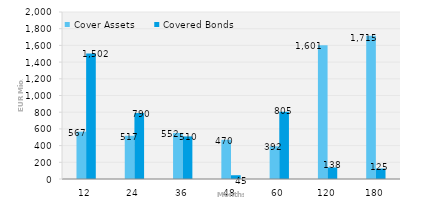
| Category | Cover Assets | Covered Bonds |
|---|---|---|
| 12.0 | 567.006 | 1501.656 |
| 24.0 | 517.4 | 790 |
| 36.0 | 551.847 | 510 |
| 48.0 | 469.637 | 45 |
| 60.0 | 391.917 | 805 |
| 120.0 | 1601.428 | 138 |
| 180.0 | 1714.725 | 125 |